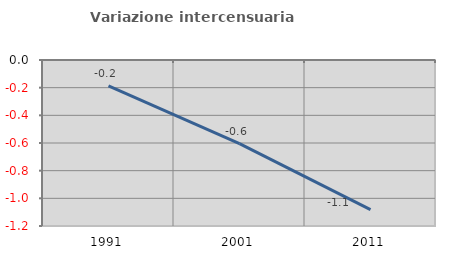
| Category | Variazione intercensuaria annua |
|---|---|
| 1991.0 | -0.187 |
| 2001.0 | -0.604 |
| 2011.0 | -1.082 |